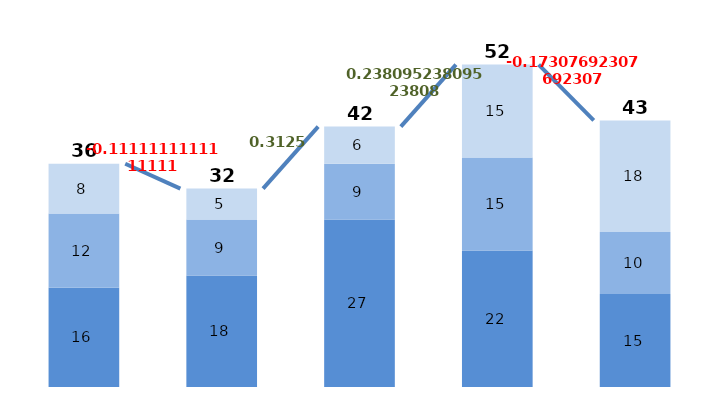
| Category | Series 0 | Series 1 | Series 2 |
|---|---|---|---|
| 0 | 16 | 12 | 8 |
| 1 | 18 | 9 | 5 |
| 2 | 27 | 9 | 6 |
| 3 | 22 | 15 | 15 |
| 4 | 15 | 10 | 18 |